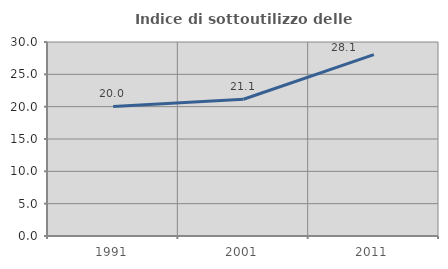
| Category | Indice di sottoutilizzo delle abitazioni  |
|---|---|
| 1991.0 | 20.035 |
| 2001.0 | 21.147 |
| 2011.0 | 28.056 |